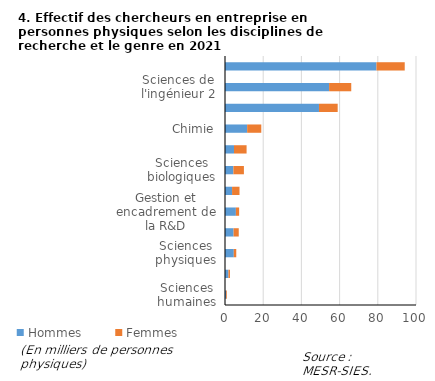
| Category | Hommes | Femmes |
|---|---|---|
| Sciences humaines | 0.6 | 0.4 |
| Sciences de la terre et environnement | 1.8 | 0.8 |
| Sciences physiques | 4.6 | 1.3 |
| Sciences sociales | 4.5 | 2.7 |
| Gestion et encadrement de la R&D | 5.7 | 1.7 |
| Sciences agricoles | 3.7 | 3.9 |
| Sciences biologiques | 4.4 | 5.5 |
| Sciences médicales | 4.7 | 6.6 |
| Chimie | 11.6 | 7.4 |
| Mathématiques et informatique | 49.2 | 9.8 |
| Sciences de l'ingénieur 2 | 54.5 | 11.6 |
| Sciences de l'ingénieur 1 | 79.3 | 14.8 |